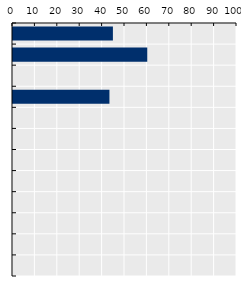
| Category | Payment rate (%) |
|---|---|
| Korea | 44.6 |
| Japan | 59.935 |
| OECD average | 0 |
| Australia | 43.054 |
| New Zealand | 0 |
| Viet Nam* | 0 |
| Singapore | 0 |
| Mongolia | 0 |
| Indonesia* | 0 |
| Thailand | 0 |
| China* | 0 |
| Malaysia | 0 |